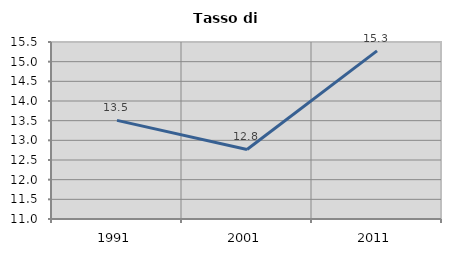
| Category | Tasso di disoccupazione   |
|---|---|
| 1991.0 | 13.508 |
| 2001.0 | 12.768 |
| 2011.0 | 15.275 |